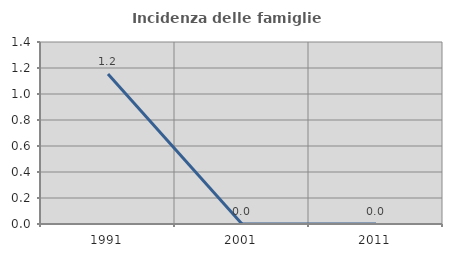
| Category | Incidenza delle famiglie numerose |
|---|---|
| 1991.0 | 1.154 |
| 2001.0 | 0 |
| 2011.0 | 0 |